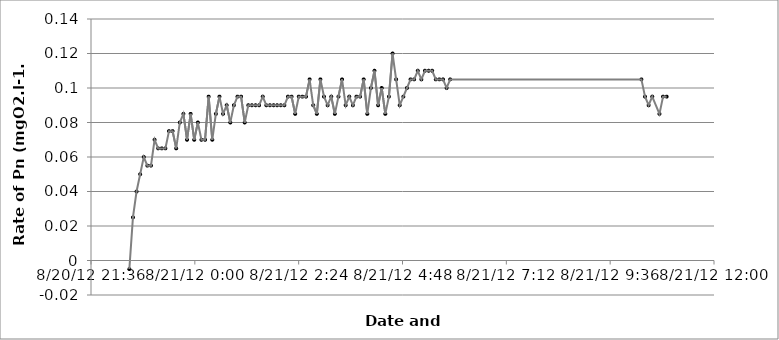
| Category | Series 0 |
|---|---|
| 41142.454409722224 | 0.095 |
| 41142.4509375 | 0.095 |
| 41142.44746527778 | 0.085 |
| 41142.440520833334 | 0.095 |
| 41142.437048611115 | 0.09 |
| 41142.43357638889 | 0.095 |
| 41142.43010416667 | 0.105 |
| 41142.24594907407 | 0.105 |
| 41142.242476851854 | 0.1 |
| 41142.23900462963 | 0.105 |
| 41142.23553240741 | 0.105 |
| 41142.23206018518 | 0.105 |
| 41142.22858796296 | 0.11 |
| 41142.22511574074 | 0.11 |
| 41142.22164351852 | 0.11 |
| 41142.2181712963 | 0.105 |
| 41142.21469907407 | 0.11 |
| 41142.211226851854 | 0.105 |
| 41142.20775462963 | 0.105 |
| 41142.20428240741 | 0.1 |
| 41142.20081018518 | 0.095 |
| 41142.19733796296 | 0.09 |
| 41142.19386574074 | 0.105 |
| 41142.19039351852 | 0.12 |
| 41142.1869212963 | 0.095 |
| 41142.18344907407 | 0.085 |
| 41142.179976851854 | 0.1 |
| 41142.17650462963 | 0.09 |
| 41142.17303240741 | 0.11 |
| 41142.16956018518 | 0.1 |
| 41142.16608796296 | 0.085 |
| 41142.16261574074 | 0.105 |
| 41142.15914351852 | 0.095 |
| 41142.1556712963 | 0.095 |
| 41142.15219907407 | 0.09 |
| 41142.148726851854 | 0.095 |
| 41142.14525462963 | 0.09 |
| 41142.14178240741 | 0.105 |
| 41142.13831018518 | 0.095 |
| 41142.13483796296 | 0.085 |
| 41142.13136574074 | 0.095 |
| 41142.12789351852 | 0.09 |
| 41142.1244212963 | 0.095 |
| 41142.12094907407 | 0.105 |
| 41142.117476851854 | 0.085 |
| 41142.11400462963 | 0.09 |
| 41142.11053240741 | 0.105 |
| 41142.10706018518 | 0.095 |
| 41142.10358796296 | 0.095 |
| 41142.10011574074 | 0.095 |
| 41142.09664351852 | 0.085 |
| 41142.0931712963 | 0.095 |
| 41142.08969907407 | 0.095 |
| 41142.086226851854 | 0.09 |
| 41142.08275462963 | 0.09 |
| 41142.07928240741 | 0.09 |
| 41142.07581018518 | 0.09 |
| 41142.07233796296 | 0.09 |
| 41142.06886574074 | 0.09 |
| 41142.06539351852 | 0.095 |
| 41142.0619212963 | 0.09 |
| 41142.05844907407 | 0.09 |
| 41142.054976851854 | 0.09 |
| 41142.05150462963 | 0.09 |
| 41142.04803240741 | 0.08 |
| 41142.04456018518 | 0.095 |
| 41142.04108796296 | 0.095 |
| 41142.03761574074 | 0.09 |
| 41142.03414351852 | 0.08 |
| 41142.0306712963 | 0.09 |
| 41142.02719907407 | 0.085 |
| 41142.023726851854 | 0.095 |
| 41142.02025462963 | 0.085 |
| 41142.01678240741 | 0.07 |
| 41142.01331018518 | 0.095 |
| 41142.00983796296 | 0.07 |
| 41142.00636574074 | 0.07 |
| 41142.00289351852 | 0.08 |
| 41141.9994212963 | 0.07 |
| 41141.99594907407 | 0.085 |
| 41141.992476851854 | 0.07 |
| 41141.98900462963 | 0.085 |
| 41141.98553240741 | 0.08 |
| 41141.98206018518 | 0.065 |
| 41141.97858796296 | 0.075 |
| 41141.97511574074 | 0.075 |
| 41141.97164351852 | 0.065 |
| 41141.9681712963 | 0.065 |
| 41141.96469907407 | 0.065 |
| 41141.961226851854 | 0.07 |
| 41141.95775462963 | 0.055 |
| 41141.95428240741 | 0.055 |
| 41141.95081018518 | 0.06 |
| 41141.94733796296 | 0.05 |
| 41141.94386574074 | 0.04 |
| 41141.94039351852 | 0.025 |
| 41141.9369212963 | -0.005 |